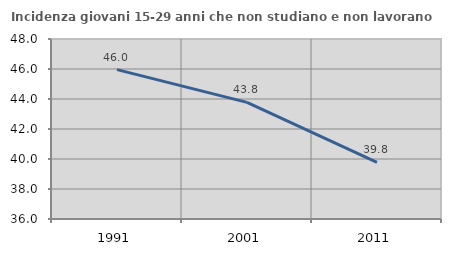
| Category | Incidenza giovani 15-29 anni che non studiano e non lavorano  |
|---|---|
| 1991.0 | 45.961 |
| 2001.0 | 43.773 |
| 2011.0 | 39.772 |